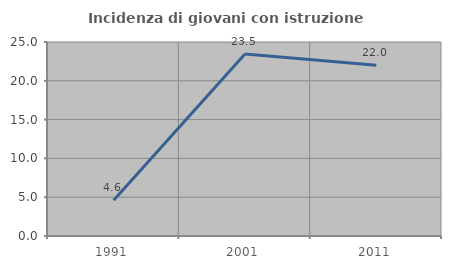
| Category | Incidenza di giovani con istruzione universitaria |
|---|---|
| 1991.0 | 4.615 |
| 2001.0 | 23.457 |
| 2011.0 | 22 |